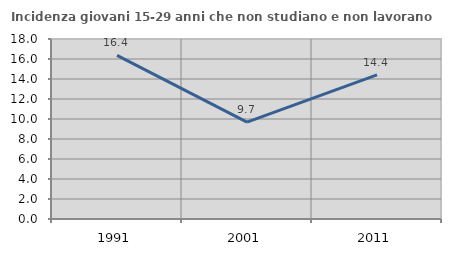
| Category | Incidenza giovani 15-29 anni che non studiano e non lavorano  |
|---|---|
| 1991.0 | 16.364 |
| 2001.0 | 9.691 |
| 2011.0 | 14.419 |